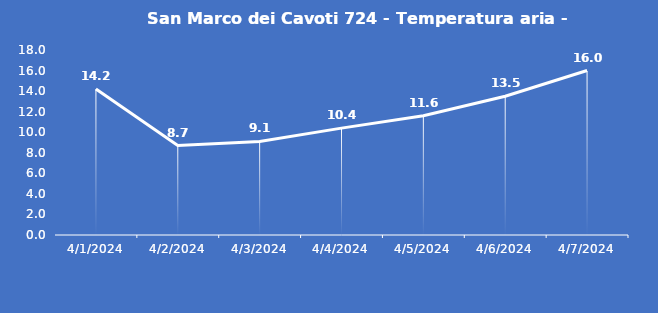
| Category | San Marco dei Cavoti 724 - Temperatura aria - Grezzo (°C) |
|---|---|
| 4/1/24 | 14.2 |
| 4/2/24 | 8.7 |
| 4/3/24 | 9.1 |
| 4/4/24 | 10.4 |
| 4/5/24 | 11.6 |
| 4/6/24 | 13.5 |
| 4/7/24 | 16 |